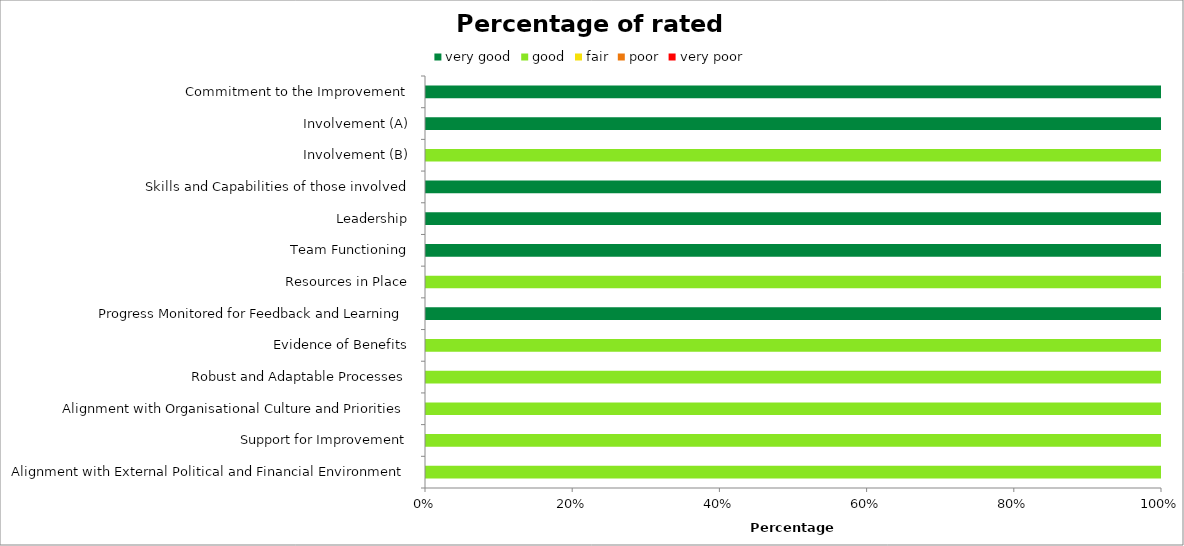
| Category | very good | good | fair | poor | very poor |
|---|---|---|---|---|---|
| Commitment to the Improvement | 1 | 0 | 0 | 0 | 0 |
| Involvement (A) | 1 | 0 | 0 | 0 | 0 |
| Involvement (B) | 0 | 1 | 0 | 0 | 0 |
| Skills and Capabilities of those involved | 1 | 0 | 0 | 0 | 0 |
| Leadership | 1 | 0 | 0 | 0 | 0 |
| Team Functioning | 1 | 0 | 0 | 0 | 0 |
| Resources in Place | 0 | 1 | 0 | 0 | 0 |
| Progress Monitored for Feedback and Learning | 1 | 0 | 0 | 0 | 0 |
| Evidence of Benefits | 0 | 1 | 0 | 0 | 0 |
| Robust and Adaptable Processes | 0 | 1 | 0 | 0 | 0 |
| Alignment with Organisational Culture and Priorities | 0 | 1 | 0 | 0 | 0 |
| Support for Improvement | 0 | 1 | 0 | 0 | 0 |
| Alignment with External Political and Financial Environment | 0 | 1 | 0 | 0 | 0 |